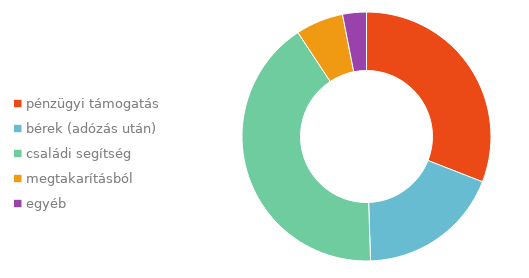
| Category | Series 0 |
|---|---|
| pénzügyi támogatás | 0.309 |
| bérek (adózás után) | 0.186 |
| családi segítség | 0.412 |
| megtakarításból | 0.062 |
| egyéb | 0.031 |